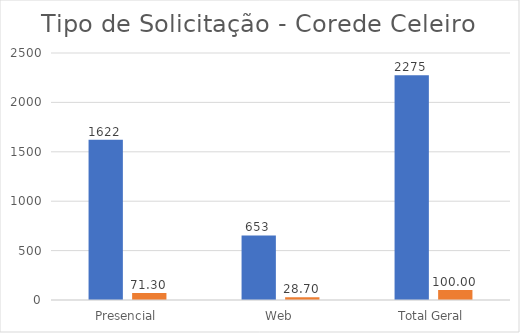
| Category | Series 0 | Series 1 |
|---|---|---|
| Presencial | 1622 | 71.297 |
| Web | 653 | 28.703 |
| Total Geral | 2275 | 100 |